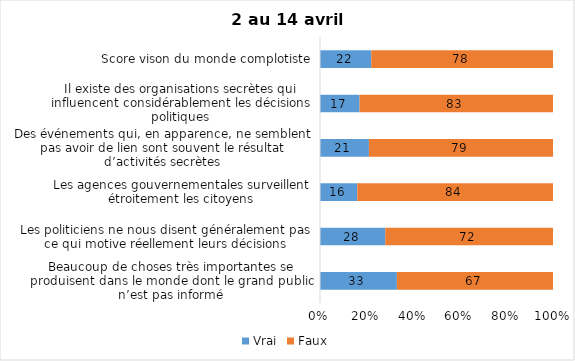
| Category | Vrai | Faux |
|---|---|---|
| Beaucoup de choses très importantes se produisent dans le monde dont le grand public n’est pas informé | 33 | 67 |
| Les politiciens ne nous disent généralement pas ce qui motive réellement leurs décisions | 28 | 72 |
| Les agences gouvernementales surveillent étroitement les citoyens | 16 | 84 |
| Des événements qui, en apparence, ne semblent pas avoir de lien sont souvent le résultat d’activités secrètes | 21 | 79 |
| Il existe des organisations secrètes qui influencent considérablement les décisions politiques | 17 | 83 |
| Score vison du monde complotiste | 22 | 78 |